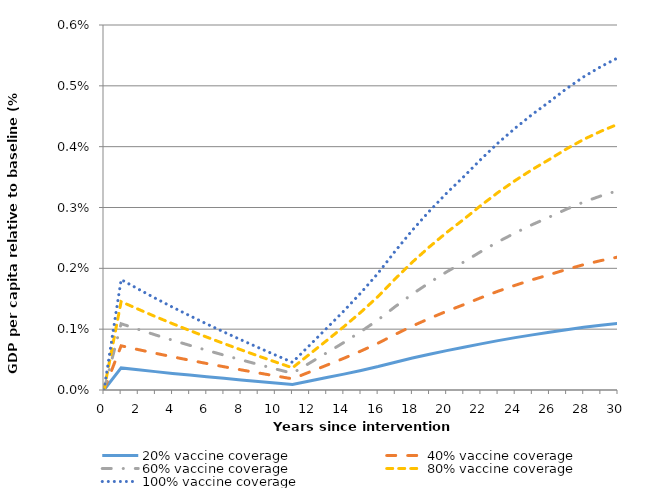
| Category | 20% vaccine coverage | 40% vaccine coverage | 60% vaccine coverage | 80% vaccine coverage | 100% vaccine coverage |
|---|---|---|---|---|---|
| 0.0 | 0 | 0 | 0 | 0 | 0 |
| 1.0 | 0 | 0.001 | 0.001 | 0.001 | 0.002 |
| 2.0 | 0 | 0.001 | 0.001 | 0.001 | 0.002 |
| 3.0 | 0 | 0.001 | 0.001 | 0.001 | 0.002 |
| 4.0 | 0 | 0.001 | 0.001 | 0.001 | 0.001 |
| 5.0 | 0 | 0 | 0.001 | 0.001 | 0.001 |
| 6.0 | 0 | 0 | 0.001 | 0.001 | 0.001 |
| 7.0 | 0 | 0 | 0.001 | 0.001 | 0.001 |
| 8.0 | 0 | 0 | 0 | 0.001 | 0.001 |
| 9.0 | 0 | 0 | 0 | 0.001 | 0.001 |
| 10.0 | 0 | 0 | 0 | 0 | 0.001 |
| 11.0 | 0 | 0 | 0 | 0 | 0 |
| 12.0 | 0 | 0 | 0 | 0.001 | 0.001 |
| 13.0 | 0 | 0 | 0.001 | 0.001 | 0.001 |
| 14.0 | 0 | 0.001 | 0.001 | 0.001 | 0.001 |
| 15.0 | 0 | 0.001 | 0.001 | 0.001 | 0.002 |
| 16.0 | 0 | 0.001 | 0.001 | 0.002 | 0.002 |
| 17.0 | 0 | 0.001 | 0.001 | 0.002 | 0.002 |
| 18.0 | 0.001 | 0.001 | 0.002 | 0.002 | 0.003 |
| 19.0 | 0.001 | 0.001 | 0.002 | 0.002 | 0.003 |
| 20.0 | 0.001 | 0.001 | 0.002 | 0.003 | 0.003 |
| 21.0 | 0.001 | 0.001 | 0.002 | 0.003 | 0.004 |
| 22.0 | 0.001 | 0.002 | 0.002 | 0.003 | 0.004 |
| 23.0 | 0.001 | 0.002 | 0.002 | 0.003 | 0.004 |
| 24.0 | 0.001 | 0.002 | 0.003 | 0.003 | 0.004 |
| 25.0 | 0.001 | 0.002 | 0.003 | 0.004 | 0.005 |
| 26.0 | 0.001 | 0.002 | 0.003 | 0.004 | 0.005 |
| 27.0 | 0.001 | 0.002 | 0.003 | 0.004 | 0.005 |
| 28.0 | 0.001 | 0.002 | 0.003 | 0.004 | 0.005 |
| 29.0 | 0.001 | 0.002 | 0.003 | 0.004 | 0.005 |
| 30.0 | 0.001 | 0.002 | 0.003 | 0.004 | 0.005 |